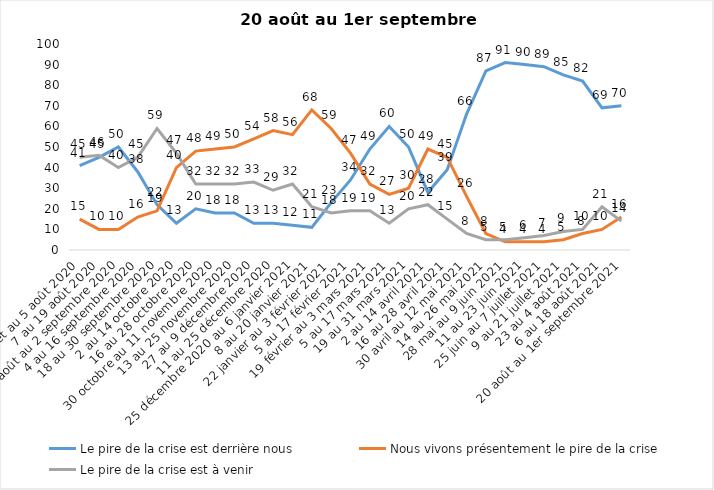
| Category | Le pire de la crise est derrière nous | Nous vivons présentement le pire de la crise | Le pire de la crise est à venir |
|---|---|---|---|
| 24 juillet au 5 août 2020 | 41 | 15 | 45 |
| 7 au 19 août 2020 | 45 | 10 | 46 |
| 21 août au 2 septembre 2020 | 50 | 10 | 40 |
| 4 au 16 septembre 2020 | 38 | 16 | 45 |
| 18 au 30 septembre 2020 | 22 | 19 | 59 |
| 2 au 14 octobre 2020 | 13 | 40 | 47 |
| 16 au 28 octobre 2020 | 20 | 48 | 32 |
| 30 octobre au 11 novembre 2020 | 18 | 49 | 32 |
| 13 au 25 novembre 2020 | 18 | 50 | 32 |
| 27 au 9 décembre 2020 | 13 | 54 | 33 |
| 11 au 25 décembre 2020 | 13 | 58 | 29 |
| 25 décembre 2020 au 6 janvier 2021 | 12 | 56 | 32 |
| 8 au 20 janvier 2021 | 11 | 68 | 21 |
| 22 janvier au 3 février 2021 | 23 | 59 | 18 |
| 5 au 17 février 2021 | 34 | 47 | 19 |
| 19 février au 3 mars 2021 | 49 | 32 | 19 |
| 5 au 17 mars 2021 | 60 | 27 | 13 |
| 19 au 31 mars 2021 | 50 | 30 | 20 |
| 2 au 14 avril 2021 | 28 | 49 | 22 |
| 16 au 28 avril 2021 | 39 | 45 | 15 |
| 30 avril au 12 mai 2021 | 66 | 26 | 8 |
| 14 au 26 mai 2021 | 87 | 8 | 5 |
| 28 mai au 9 juin 2021 | 91 | 4 | 5 |
| 11 au 23 juin 2021 | 90 | 4 | 6 |
| 25 juin au 7 juillet 2021 | 89 | 4 | 7 |
| 9 au 21 juillet 2021 | 85 | 5 | 9 |
| 23 au 4 août 2021 | 82 | 8 | 10 |
| 6 au 18 août 2021 | 69 | 10 | 21 |
| 20 août au 1er septembre 2021 | 70 | 16 | 14 |